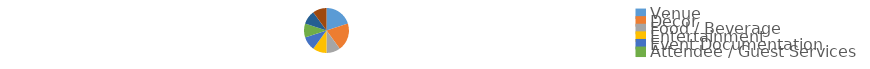
| Category | % OF BUDGET | SUBTOTALS |
|---|---|---|
| Venue | 0.2 | 100 |
| Décor | 0.2 | 100 |
| Food / Beverage | 0.1 | 50 |
| Entertainment | 0.1 | 50 |
| Event Documentation | 0.1 | 50 |
| Attendee / Guest Services | 0.1 | 50 |
| Invitations | 0.1 | 50 |
| Other | 0.1 | 50 |